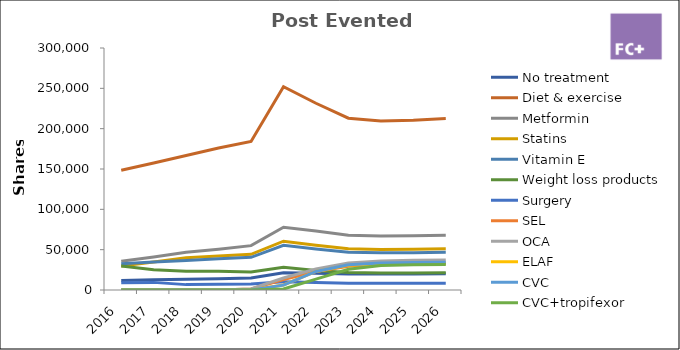
| Category | No treatment | Diet & exercise | Metformin | Statins | Vitamin E | Weight loss products | Surgery | SEL | OCA | ELAF | CVC | CVC+tropifexor |
|---|---|---|---|---|---|---|---|---|---|---|---|---|
| 2016.0 | 11880 | 148500 | 35640 | 29700 | 32670 | 29700 | 8910 | 0 | 0 | 0 | 0 | 0 |
| 2017.0 | 12598.74 | 157484.25 | 40945.905 | 34646.535 | 34646.535 | 25197.48 | 9449.055 | 0 | 0 | 0 | 0 | 0 |
| 2018.0 | 13330.667 | 166633.335 | 46657.334 | 39992 | 36659.334 | 23328.667 | 6665.333 | 0 | 0 | 0 | 0 | 0 |
| 2019.0 | 14075.972 | 175949.653 | 50628.845 | 42227.917 | 38708.924 | 23270.009 | 7037.986 | 0 | 0 | 0 | 0 | 0 |
| 2020.0 | 14834.851 | 184106.81 | 55009.764 | 44185.634 | 40503.498 | 22315.096 | 7364.272 | 1188.863 | 1362.48 | 0 | 0 | 0 |
| 2021.0 | 21374.748 | 251962.657 | 77751.15 | 60471.038 | 55431.784 | 28073.166 | 10078.506 | 12936.528 | 14816.014 | 6207.929 | 5990.361 | 1168.593 |
| 2022.0 | 20765.602 | 231496.355 | 73107.387 | 55559.125 | 50929.198 | 24121.082 | 9259.854 | 22909.683 | 26143.31 | 23030.376 | 23003.236 | 13468.894 |
| 2023.0 | 19915.934 | 212994.373 | 67896.012 | 51118.65 | 46858.762 | 21561.625 | 8519.775 | 29517.685 | 33614.018 | 30563.799 | 31201.985 | 25769.426 |
| 2024.0 | 19814.924 | 209447.662 | 67023.252 | 50267.439 | 46078.486 | 20944.766 | 8377.906 | 31508.684 | 35858.107 | 32388.02 | 33319.717 | 30298.4 |
| 2025.0 | 19964.762 | 210404.875 | 67329.56 | 50497.17 | 46289.072 | 21040.487 | 8416.195 | 32286.675 | 36742.211 | 33016.271 | 33992.887 | 31200.472 |
| 2026.0 | 20164.409 | 212508.924 | 68002.856 | 51002.142 | 46751.963 | 21250.892 | 8500.357 | 32609.542 | 37109.633 | 33346.434 | 34332.816 | 31512.477 |